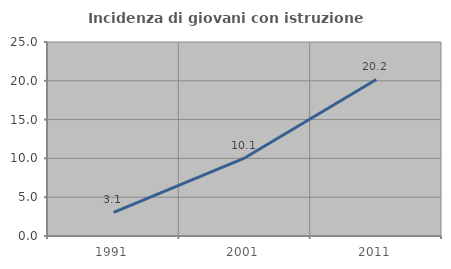
| Category | Incidenza di giovani con istruzione universitaria |
|---|---|
| 1991.0 | 3.052 |
| 2001.0 | 10.08 |
| 2011.0 | 20.178 |